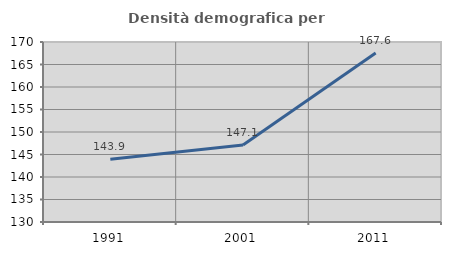
| Category | Densità demografica |
|---|---|
| 1991.0 | 143.94 |
| 2001.0 | 147.104 |
| 2011.0 | 167.568 |